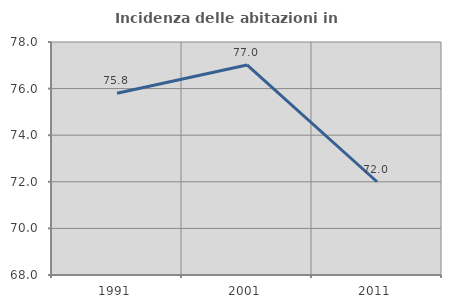
| Category | Incidenza delle abitazioni in proprietà  |
|---|---|
| 1991.0 | 75.798 |
| 2001.0 | 77.015 |
| 2011.0 | 72.002 |